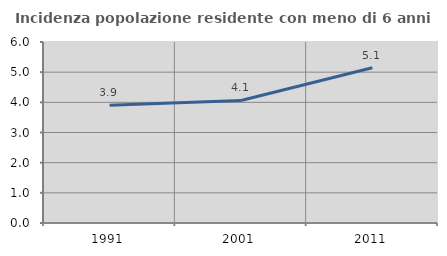
| Category | Incidenza popolazione residente con meno di 6 anni |
|---|---|
| 1991.0 | 3.906 |
| 2001.0 | 4.061 |
| 2011.0 | 5.147 |